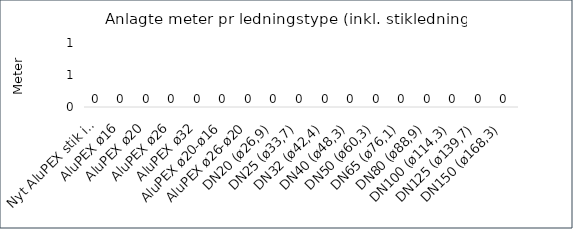
| Category | Series 1 |
|---|---|
| Nyt AluPEX stik inkl. Tracé | 0 |
| AluPEX ø16 | 0 |
| AluPEX ø20 | 0 |
| AluPEX ø26 | 0 |
| AluPEX ø32 | 0 |
| AluPEX ø20-ø16 | 0 |
| AluPEX ø26-ø20 | 0 |
| DN20 (ø26,9) | 0 |
| DN25 (ø33,7) | 0 |
| DN32 (ø42,4) | 0 |
| DN40 (ø48,3) | 0 |
| DN50 (ø60,3) | 0 |
| DN65 (ø76,1) | 0 |
| DN80 (ø88,9) | 0 |
| DN100 (ø114,3) | 0 |
| DN125 (ø139,7) | 0 |
| DN150 (ø168,3) | 0 |